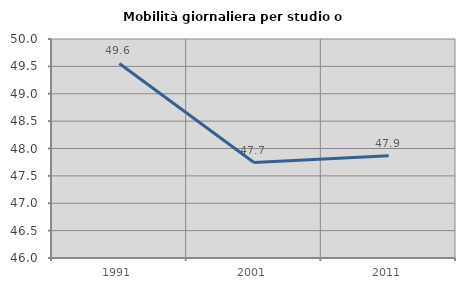
| Category | Mobilità giornaliera per studio o lavoro |
|---|---|
| 1991.0 | 49.554 |
| 2001.0 | 47.743 |
| 2011.0 | 47.865 |